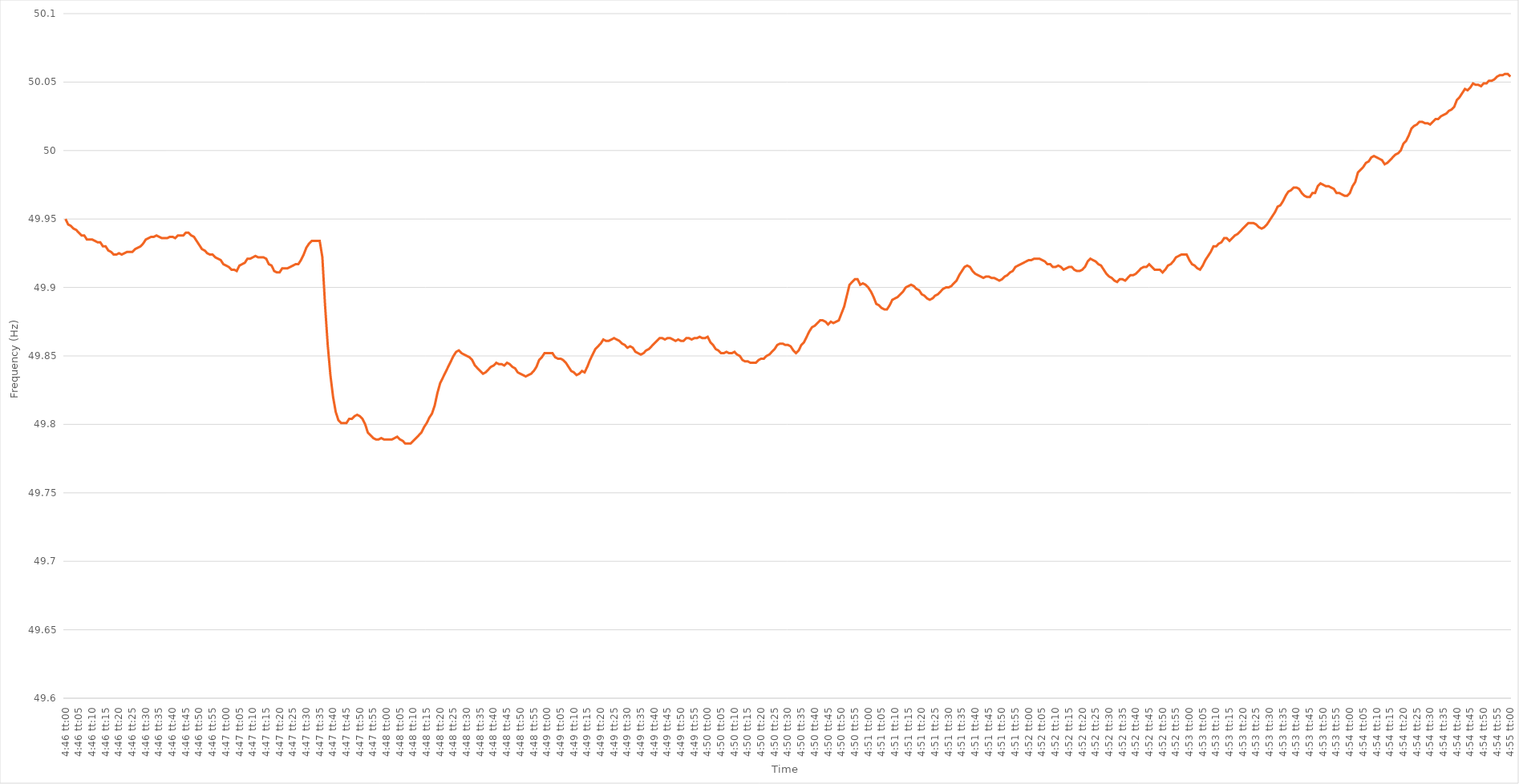
| Category | Series 0 |
|---|---|
| 0.1986111111111111 | 49.95 |
| 0.1986226851851852 | 49.946 |
| 0.19863425925925926 | 49.945 |
| 0.19864583333333333 | 49.943 |
| 0.19865740740740742 | 49.942 |
| 0.1986689814814815 | 49.94 |
| 0.19868055555555555 | 49.938 |
| 0.19869212962962965 | 49.938 |
| 0.19870370370370372 | 49.935 |
| 0.19871527777777778 | 49.935 |
| 0.19872685185185182 | 49.935 |
| 0.19873842592592594 | 49.934 |
| 0.19874999999999998 | 49.933 |
| 0.1987615740740741 | 49.933 |
| 0.19877314814814814 | 49.93 |
| 0.1987847222222222 | 49.93 |
| 0.19879629629629628 | 49.927 |
| 0.19880787037037037 | 49.926 |
| 0.19881944444444444 | 49.924 |
| 0.1988310185185185 | 49.924 |
| 0.1988425925925926 | 49.925 |
| 0.19885416666666667 | 49.924 |
| 0.19886574074074073 | 49.925 |
| 0.19887731481481483 | 49.926 |
| 0.1988888888888889 | 49.926 |
| 0.19890046296296296 | 49.926 |
| 0.19891203703703705 | 49.928 |
| 0.19892361111111112 | 49.929 |
| 0.1989351851851852 | 49.93 |
| 0.19894675925925928 | 49.932 |
| 0.19895833333333335 | 49.935 |
| 0.1989699074074074 | 49.936 |
| 0.1989814814814815 | 49.937 |
| 0.19899305555555555 | 49.937 |
| 0.19900462962962964 | 49.938 |
| 0.19901620370370368 | 49.937 |
| 0.19902777777777778 | 49.936 |
| 0.19903935185185184 | 49.936 |
| 0.1990509259259259 | 49.936 |
| 0.1990625 | 49.937 |
| 0.19907407407407407 | 49.937 |
| 0.19908564814814814 | 49.936 |
| 0.19909722222222223 | 49.938 |
| 0.1991087962962963 | 49.938 |
| 0.19912037037037036 | 49.938 |
| 0.19913194444444446 | 49.94 |
| 0.19914351851851853 | 49.94 |
| 0.1991550925925926 | 49.938 |
| 0.1991666666666667 | 49.937 |
| 0.19917824074074075 | 49.934 |
| 0.19918981481481482 | 49.931 |
| 0.19920138888888891 | 49.928 |
| 0.19921296296296295 | 49.927 |
| 0.19922453703703705 | 49.925 |
| 0.19923611111111109 | 49.924 |
| 0.19924768518518518 | 49.924 |
| 0.19925925925925925 | 49.922 |
| 0.1992708333333333 | 49.921 |
| 0.1992824074074074 | 49.92 |
| 0.19929398148148147 | 49.917 |
| 0.19930555555555554 | 49.916 |
| 0.19931712962962964 | 49.915 |
| 0.1993287037037037 | 49.913 |
| 0.19934027777777777 | 49.913 |
| 0.19935185185185186 | 49.912 |
| 0.19936342592592593 | 49.916 |
| 0.199375 | 49.917 |
| 0.1993865740740741 | 49.918 |
| 0.19939814814814816 | 49.921 |
| 0.19940972222222222 | 49.921 |
| 0.19942129629629632 | 49.922 |
| 0.19943287037037036 | 49.923 |
| 0.19944444444444445 | 49.922 |
| 0.1994560185185185 | 49.922 |
| 0.1994675925925926 | 49.922 |
| 0.19947916666666665 | 49.921 |
| 0.19949074074074072 | 49.917 |
| 0.1995023148148148 | 49.916 |
| 0.19951388888888888 | 49.912 |
| 0.19952546296296295 | 49.911 |
| 0.19953703703703704 | 49.911 |
| 0.1995486111111111 | 49.914 |
| 0.19956018518518517 | 49.914 |
| 0.19957175925925927 | 49.914 |
| 0.19958333333333333 | 49.915 |
| 0.1995949074074074 | 49.916 |
| 0.1996064814814815 | 49.917 |
| 0.19961805555555556 | 49.917 |
| 0.19962962962962963 | 49.92 |
| 0.19964120370370372 | 49.924 |
| 0.1996527777777778 | 49.929 |
| 0.19966435185185186 | 49.932 |
| 0.1996759259259259 | 49.934 |
| 0.19968750000000002 | 49.934 |
| 0.19969907407407406 | 49.934 |
| 0.19971064814814818 | 49.934 |
| 0.19972222222222222 | 49.922 |
| 0.19973379629629628 | 49.887 |
| 0.19974537037037035 | 49.858 |
| 0.19975694444444445 | 49.836 |
| 0.1997685185185185 | 49.82 |
| 0.19978009259259258 | 49.809 |
| 0.19979166666666667 | 49.803 |
| 0.19980324074074074 | 49.801 |
| 0.1998148148148148 | 49.801 |
| 0.1998263888888889 | 49.801 |
| 0.19983796296296297 | 49.804 |
| 0.19984953703703703 | 49.804 |
| 0.19986111111111113 | 49.806 |
| 0.1998726851851852 | 49.807 |
| 0.19988425925925926 | 49.806 |
| 0.19989583333333336 | 49.804 |
| 0.19990740740740742 | 49.8 |
| 0.19991898148148146 | 49.794 |
| 0.19993055555555558 | 49.792 |
| 0.19994212962962962 | 49.79 |
| 0.1999537037037037 | 49.789 |
| 0.19996527777777776 | 49.789 |
| 0.19997685185185185 | 49.79 |
| 0.19998842592592592 | 49.789 |
| 0.19999999999999998 | 49.789 |
| 0.20001157407407408 | 49.789 |
| 0.20002314814814814 | 49.789 |
| 0.2000347222222222 | 49.79 |
| 0.2000462962962963 | 49.791 |
| 0.20005787037037037 | 49.789 |
| 0.20006944444444444 | 49.788 |
| 0.20008101851851853 | 49.786 |
| 0.2000925925925926 | 49.786 |
| 0.20010416666666667 | 49.786 |
| 0.20011574074074076 | 49.788 |
| 0.20012731481481483 | 49.79 |
| 0.2001388888888889 | 49.792 |
| 0.200150462962963 | 49.794 |
| 0.20016203703703703 | 49.798 |
| 0.20017361111111112 | 49.801 |
| 0.20018518518518516 | 49.805 |
| 0.20019675925925925 | 49.808 |
| 0.20020833333333332 | 49.814 |
| 0.2002199074074074 | 49.823 |
| 0.20023148148148148 | 49.83 |
| 0.20024305555555555 | 49.834 |
| 0.20025462962962962 | 49.838 |
| 0.2002662037037037 | 49.842 |
| 0.20027777777777778 | 49.846 |
| 0.20028935185185184 | 49.85 |
| 0.20030092592592594 | 49.853 |
| 0.2003125 | 49.854 |
| 0.20032407407407407 | 49.852 |
| 0.20033564814814817 | 49.851 |
| 0.20034722222222223 | 49.85 |
| 0.2003587962962963 | 49.849 |
| 0.2003703703703704 | 49.847 |
| 0.20038194444444443 | 49.843 |
| 0.20039351851851853 | 49.841 |
| 0.20040509259259257 | 49.839 |
| 0.2004166666666667 | 49.837 |
| 0.20042824074074073 | 49.838 |
| 0.2004398148148148 | 49.84 |
| 0.2004513888888889 | 49.842 |
| 0.20046296296296295 | 49.843 |
| 0.20047453703703702 | 49.845 |
| 0.20048611111111111 | 49.844 |
| 0.20049768518518518 | 49.844 |
| 0.20050925925925925 | 49.843 |
| 0.20052083333333334 | 49.845 |
| 0.2005324074074074 | 49.844 |
| 0.20054398148148148 | 49.842 |
| 0.20055555555555557 | 49.841 |
| 0.20056712962962964 | 49.838 |
| 0.2005787037037037 | 49.837 |
| 0.2005902777777778 | 49.836 |
| 0.20060185185185186 | 49.835 |
| 0.20061342592592593 | 49.836 |
| 0.20062499999999997 | 49.837 |
| 0.2006365740740741 | 49.839 |
| 0.20064814814814813 | 49.842 |
| 0.20065972222222225 | 49.847 |
| 0.2006712962962963 | 49.849 |
| 0.20068287037037036 | 49.852 |
| 0.20069444444444443 | 49.852 |
| 0.20070601851851852 | 49.852 |
| 0.2007175925925926 | 49.852 |
| 0.20072916666666665 | 49.849 |
| 0.20074074074074075 | 49.848 |
| 0.20075231481481481 | 49.848 |
| 0.20076388888888888 | 49.847 |
| 0.20077546296296298 | 49.845 |
| 0.20078703703703704 | 49.842 |
| 0.2007986111111111 | 49.839 |
| 0.2008101851851852 | 49.838 |
| 0.20082175925925927 | 49.836 |
| 0.20083333333333334 | 49.837 |
| 0.20084490740740743 | 49.839 |
| 0.2008564814814815 | 49.838 |
| 0.20086805555555554 | 49.842 |
| 0.20087962962962966 | 49.847 |
| 0.2008912037037037 | 49.851 |
| 0.20090277777777776 | 49.855 |
| 0.20091435185185183 | 49.857 |
| 0.20092592592592592 | 49.859 |
| 0.2009375 | 49.862 |
| 0.20094907407407406 | 49.861 |
| 0.20096064814814815 | 49.861 |
| 0.20097222222222222 | 49.862 |
| 0.20098379629629629 | 49.863 |
| 0.20099537037037038 | 49.862 |
| 0.20100694444444445 | 49.861 |
| 0.2010185185185185 | 49.859 |
| 0.2010300925925926 | 49.858 |
| 0.20104166666666667 | 49.856 |
| 0.20105324074074074 | 49.857 |
| 0.20106481481481484 | 49.856 |
| 0.2010763888888889 | 49.853 |
| 0.20108796296296297 | 49.852 |
| 0.20109953703703706 | 49.851 |
| 0.2011111111111111 | 49.852 |
| 0.2011226851851852 | 49.854 |
| 0.20113425925925923 | 49.855 |
| 0.20114583333333333 | 49.857 |
| 0.2011574074074074 | 49.859 |
| 0.20116898148148146 | 49.861 |
| 0.20118055555555556 | 49.863 |
| 0.20119212962962962 | 49.863 |
| 0.2012037037037037 | 49.862 |
| 0.20121527777777778 | 49.863 |
| 0.20122685185185185 | 49.863 |
| 0.20123842592592592 | 49.862 |
| 0.20125 | 49.861 |
| 0.20126157407407408 | 49.862 |
| 0.20127314814814815 | 49.861 |
| 0.20128472222222224 | 49.861 |
| 0.2012962962962963 | 49.863 |
| 0.20130787037037037 | 49.863 |
| 0.20131944444444447 | 49.862 |
| 0.2013310185185185 | 49.863 |
| 0.2013425925925926 | 49.863 |
| 0.20135416666666664 | 49.864 |
| 0.20136574074074076 | 49.863 |
| 0.2013773148148148 | 49.863 |
| 0.20138888888888887 | 49.864 |
| 0.20140046296296296 | 49.86 |
| 0.20141203703703703 | 49.858 |
| 0.2014236111111111 | 49.855 |
| 0.2014351851851852 | 49.854 |
| 0.20144675925925926 | 49.852 |
| 0.20145833333333332 | 49.852 |
| 0.20146990740740742 | 49.853 |
| 0.20148148148148148 | 49.852 |
| 0.20149305555555555 | 49.852 |
| 0.20150462962962964 | 49.853 |
| 0.2015162037037037 | 49.851 |
| 0.20152777777777778 | 49.85 |
| 0.20153935185185187 | 49.847 |
| 0.20155092592592594 | 49.846 |
| 0.2015625 | 49.846 |
| 0.20157407407407404 | 49.845 |
| 0.20158564814814817 | 49.845 |
| 0.2015972222222222 | 49.845 |
| 0.20160879629629633 | 49.847 |
| 0.20162037037037037 | 49.848 |
| 0.20163194444444443 | 49.848 |
| 0.2016435185185185 | 49.85 |
| 0.2016550925925926 | 49.851 |
| 0.20166666666666666 | 49.853 |
| 0.20167824074074073 | 49.855 |
| 0.20168981481481482 | 49.858 |
| 0.2017013888888889 | 49.859 |
| 0.20171296296296296 | 49.859 |
| 0.20172453703703705 | 49.858 |
| 0.20173611111111112 | 49.858 |
| 0.20174768518518518 | 49.857 |
| 0.20175925925925928 | 49.854 |
| 0.20177083333333334 | 49.852 |
| 0.2017824074074074 | 49.854 |
| 0.2017939814814815 | 49.858 |
| 0.20180555555555557 | 49.86 |
| 0.2018171296296296 | 49.864 |
| 0.20182870370370373 | 49.868 |
| 0.20184027777777777 | 49.871 |
| 0.20185185185185184 | 49.872 |
| 0.2018634259259259 | 49.874 |
| 0.201875 | 49.876 |
| 0.20188657407407407 | 49.876 |
| 0.20189814814814813 | 49.875 |
| 0.20190972222222223 | 49.873 |
| 0.2019212962962963 | 49.875 |
| 0.20193287037037036 | 49.874 |
| 0.20194444444444445 | 49.875 |
| 0.20195601851851852 | 49.876 |
| 0.2019675925925926 | 49.881 |
| 0.20197916666666668 | 49.886 |
| 0.20199074074074075 | 49.894 |
| 0.20200231481481482 | 49.902 |
| 0.2020138888888889 | 49.904 |
| 0.20202546296296298 | 49.906 |
| 0.20203703703703701 | 49.906 |
| 0.20204861111111114 | 49.902 |
| 0.20206018518518518 | 49.903 |
| 0.20207175925925927 | 49.902 |
| 0.2020833333333333 | 49.9 |
| 0.2020949074074074 | 49.897 |
| 0.20210648148148147 | 49.893 |
| 0.20211805555555554 | 49.888 |
| 0.20212962962962963 | 49.887 |
| 0.2021412037037037 | 49.885 |
| 0.20215277777777776 | 49.884 |
| 0.20216435185185186 | 49.884 |
| 0.20217592592592593 | 49.887 |
| 0.2021875 | 49.891 |
| 0.2021990740740741 | 49.892 |
| 0.20221064814814815 | 49.893 |
| 0.20222222222222222 | 49.895 |
| 0.20223379629629631 | 49.897 |
| 0.20224537037037038 | 49.9 |
| 0.20225694444444445 | 49.901 |
| 0.20226851851851854 | 49.902 |
| 0.20228009259259258 | 49.901 |
| 0.20229166666666668 | 49.899 |
| 0.20230324074074071 | 49.898 |
| 0.20231481481481484 | 49.895 |
| 0.20232638888888888 | 49.894 |
| 0.20233796296296294 | 49.892 |
| 0.20234953703703704 | 49.891 |
| 0.2023611111111111 | 49.892 |
| 0.20237268518518517 | 49.894 |
| 0.20238425925925926 | 49.895 |
| 0.20239583333333333 | 49.897 |
| 0.2024074074074074 | 49.899 |
| 0.2024189814814815 | 49.9 |
| 0.20243055555555556 | 49.9 |
| 0.20244212962962962 | 49.901 |
| 0.20245370370370372 | 49.903 |
| 0.20246527777777779 | 49.905 |
| 0.20247685185185185 | 49.909 |
| 0.20248842592592595 | 49.912 |
| 0.2025 | 49.915 |
| 0.20251157407407408 | 49.916 |
| 0.20252314814814812 | 49.915 |
| 0.20253472222222224 | 49.912 |
| 0.20254629629629628 | 49.91 |
| 0.20255787037037035 | 49.909 |
| 0.20256944444444444 | 49.908 |
| 0.2025810185185185 | 49.907 |
| 0.20259259259259257 | 49.908 |
| 0.20260416666666667 | 49.908 |
| 0.20261574074074074 | 49.907 |
| 0.2026273148148148 | 49.907 |
| 0.2026388888888889 | 49.906 |
| 0.20265046296296296 | 49.905 |
| 0.20266203703703703 | 49.906 |
| 0.20267361111111112 | 49.908 |
| 0.2026851851851852 | 49.909 |
| 0.20269675925925926 | 49.911 |
| 0.20270833333333335 | 49.912 |
| 0.20271990740740742 | 49.915 |
| 0.20273148148148148 | 49.916 |
| 0.20274305555555558 | 49.917 |
| 0.20275462962962965 | 49.918 |
| 0.20276620370370368 | 49.919 |
| 0.2027777777777778 | 49.92 |
| 0.20278935185185185 | 49.92 |
| 0.2028009259259259 | 49.921 |
| 0.20281249999999998 | 49.921 |
| 0.20282407407407407 | 49.921 |
| 0.20283564814814814 | 49.92 |
| 0.2028472222222222 | 49.919 |
| 0.2028587962962963 | 49.917 |
| 0.20287037037037037 | 49.917 |
| 0.20288194444444443 | 49.915 |
| 0.20289351851851853 | 49.915 |
| 0.2029050925925926 | 49.916 |
| 0.20291666666666666 | 49.915 |
| 0.20292824074074076 | 49.913 |
| 0.20293981481481482 | 49.914 |
| 0.2029513888888889 | 49.915 |
| 0.20296296296296298 | 49.915 |
| 0.20297453703703705 | 49.913 |
| 0.2029861111111111 | 49.912 |
| 0.2029976851851852 | 49.912 |
| 0.20300925925925925 | 49.913 |
| 0.20302083333333334 | 49.915 |
| 0.20303240740740738 | 49.919 |
| 0.20304398148148148 | 49.921 |
| 0.20305555555555554 | 49.92 |
| 0.2030671296296296 | 49.919 |
| 0.2030787037037037 | 49.917 |
| 0.20309027777777777 | 49.916 |
| 0.20310185185185184 | 49.913 |
| 0.20311342592592593 | 49.91 |
| 0.203125 | 49.908 |
| 0.20313657407407407 | 49.907 |
| 0.20314814814814816 | 49.905 |
| 0.20315972222222223 | 49.904 |
| 0.2031712962962963 | 49.906 |
| 0.2031828703703704 | 49.906 |
| 0.20319444444444446 | 49.905 |
| 0.20320601851851852 | 49.907 |
| 0.20321759259259262 | 49.909 |
| 0.20322916666666666 | 49.909 |
| 0.20324074074074075 | 49.91 |
| 0.2032523148148148 | 49.912 |
| 0.2032638888888889 | 49.914 |
| 0.20327546296296295 | 49.915 |
| 0.20328703703703702 | 49.915 |
| 0.2032986111111111 | 49.917 |
| 0.20331018518518518 | 49.915 |
| 0.20332175925925924 | 49.913 |
| 0.20333333333333334 | 49.913 |
| 0.2033449074074074 | 49.913 |
| 0.20335648148148147 | 49.911 |
| 0.20336805555555557 | 49.913 |
| 0.20337962962962963 | 49.916 |
| 0.2033912037037037 | 49.917 |
| 0.2034027777777778 | 49.919 |
| 0.20341435185185186 | 49.922 |
| 0.20342592592592593 | 49.923 |
| 0.20343750000000002 | 49.924 |
| 0.2034490740740741 | 49.924 |
| 0.20346064814814815 | 49.924 |
| 0.2034722222222222 | 49.92 |
| 0.20348379629629632 | 49.917 |
| 0.20349537037037035 | 49.916 |
| 0.20350694444444442 | 49.914 |
| 0.20351851851851852 | 49.913 |
| 0.20353009259259258 | 49.916 |
| 0.20354166666666665 | 49.92 |
| 0.20355324074074074 | 49.923 |
| 0.2035648148148148 | 49.926 |
| 0.20357638888888888 | 49.93 |
| 0.20358796296296297 | 49.93 |
| 0.20359953703703704 | 49.932 |
| 0.2036111111111111 | 49.933 |
| 0.2036226851851852 | 49.936 |
| 0.20363425925925926 | 49.936 |
| 0.20364583333333333 | 49.934 |
| 0.20365740740740743 | 49.936 |
| 0.2036689814814815 | 49.938 |
| 0.20368055555555556 | 49.939 |
| 0.20369212962962965 | 49.941 |
| 0.20370370370370372 | 49.943 |
| 0.20371527777777776 | 49.945 |
| 0.20372685185185188 | 49.947 |
| 0.20373842592592592 | 49.947 |
| 0.20375 | 49.947 |
| 0.20376157407407405 | 49.946 |
| 0.20377314814814815 | 49.944 |
| 0.20378472222222221 | 49.943 |
| 0.20379629629629628 | 49.944 |
| 0.20380787037037038 | 49.946 |
| 0.20381944444444444 | 49.949 |
| 0.2038310185185185 | 49.952 |
| 0.2038425925925926 | 49.955 |
| 0.20385416666666667 | 49.959 |
| 0.20386574074074074 | 49.96 |
| 0.20387731481481483 | 49.963 |
| 0.2038888888888889 | 49.967 |
| 0.20390046296296296 | 49.97 |
| 0.20391203703703706 | 49.971 |
| 0.20392361111111112 | 49.973 |
| 0.20393518518518516 | 49.973 |
| 0.20394675925925929 | 49.972 |
| 0.20395833333333332 | 49.969 |
| 0.20396990740740742 | 49.967 |
| 0.20398148148148146 | 49.966 |
| 0.20399305555555555 | 49.966 |
| 0.20400462962962962 | 49.969 |
| 0.20401620370370369 | 49.969 |
| 0.20402777777777778 | 49.974 |
| 0.20403935185185185 | 49.976 |
| 0.2040509259259259 | 49.975 |
| 0.2040625 | 49.974 |
| 0.20407407407407407 | 49.974 |
| 0.20408564814814814 | 49.973 |
| 0.20409722222222224 | 49.972 |
| 0.2041087962962963 | 49.969 |
| 0.20412037037037037 | 49.969 |
| 0.20413194444444446 | 49.968 |
| 0.20414351851851853 | 49.967 |
| 0.2041550925925926 | 49.967 |
| 0.2041666666666667 | 49.969 |
| 0.20417824074074073 | 49.974 |
| 0.20418981481481482 | 49.977 |
| 0.20420138888888886 | 49.984 |
| 0.20421296296296299 | 49.986 |
| 0.20422453703703702 | 49.988 |
| 0.2042361111111111 | 49.991 |
| 0.20424768518518518 | 49.992 |
| 0.20425925925925925 | 49.995 |
| 0.20427083333333332 | 49.996 |
| 0.2042824074074074 | 49.995 |
| 0.20429398148148148 | 49.994 |
| 0.20430555555555555 | 49.993 |
| 0.20431712962962964 | 49.99 |
| 0.2043287037037037 | 49.991 |
| 0.20434027777777777 | 49.993 |
| 0.20435185185185187 | 49.995 |
| 0.20436342592592593 | 49.997 |
| 0.204375 | 49.998 |
| 0.2043865740740741 | 50 |
| 0.20439814814814816 | 50.005 |
| 0.20440972222222223 | 50.007 |
| 0.20442129629629627 | 50.011 |
| 0.2044328703703704 | 50.016 |
| 0.20444444444444443 | 50.018 |
| 0.2044560185185185 | 50.019 |
| 0.2044675925925926 | 50.021 |
| 0.20447916666666666 | 50.021 |
| 0.20449074074074072 | 50.02 |
| 0.20450231481481482 | 50.02 |
| 0.20451388888888888 | 50.019 |
| 0.20452546296296295 | 50.021 |
| 0.20453703703703704 | 50.023 |
| 0.2045486111111111 | 50.023 |
| 0.20456018518518518 | 50.025 |
| 0.20457175925925927 | 50.026 |
| 0.20458333333333334 | 50.027 |
| 0.2045949074074074 | 50.029 |
| 0.2046064814814815 | 50.03 |
| 0.20461805555555557 | 50.032 |
| 0.20462962962962963 | 50.037 |
| 0.20464120370370367 | 50.039 |
| 0.2046527777777778 | 50.042 |
| 0.20466435185185183 | 50.045 |
| 0.20467592592592596 | 50.044 |
| 0.2046875 | 50.046 |
| 0.20469907407407406 | 50.049 |
| 0.20471064814814813 | 50.048 |
| 0.20472222222222222 | 50.048 |
| 0.2047337962962963 | 50.047 |
| 0.20474537037037036 | 50.049 |
| 0.20475694444444445 | 50.049 |
| 0.20476851851851852 | 50.051 |
| 0.20478009259259258 | 50.051 |
| 0.20479166666666668 | 50.052 |
| 0.20480324074074074 | 50.054 |
| 0.2048148148148148 | 50.055 |
| 0.2048263888888889 | 50.055 |
| 0.20483796296296297 | 50.056 |
| 0.20484953703703704 | 50.056 |
| 0.20486111111111113 | 50.054 |